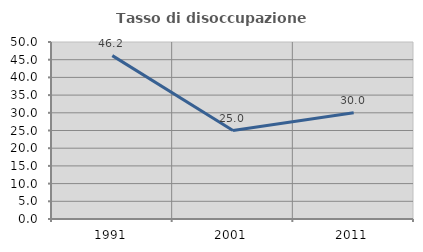
| Category | Tasso di disoccupazione giovanile  |
|---|---|
| 1991.0 | 46.154 |
| 2001.0 | 25 |
| 2011.0 | 30 |